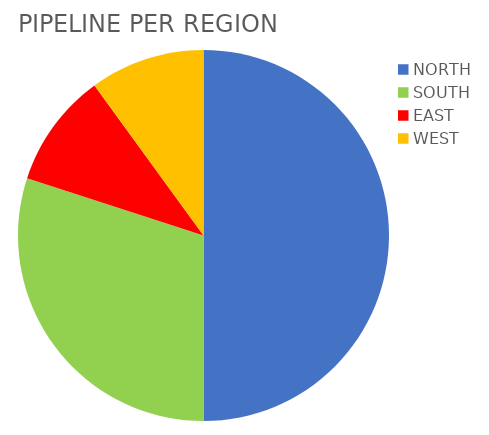
| Category | Series 0 |
|---|---|
| NORTH | 5 |
| SOUTH | 3 |
| EAST | 1 |
| WEST | 1 |